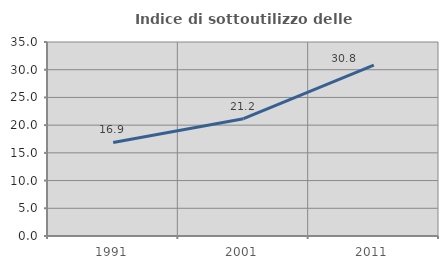
| Category | Indice di sottoutilizzo delle abitazioni  |
|---|---|
| 1991.0 | 16.88 |
| 2001.0 | 21.167 |
| 2011.0 | 30.83 |